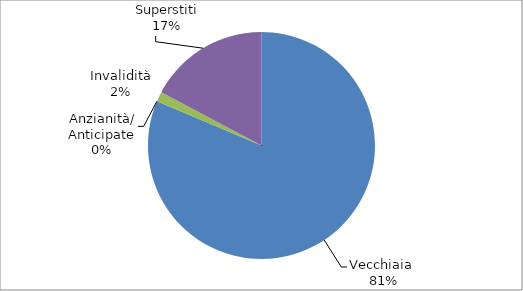
| Category | Series 0 |
|---|---|
| Vecchiaia  | 15862 |
| Anzianità/ Anticipate | 0 |
| Invalidità | 276 |
| Superstiti | 3357 |